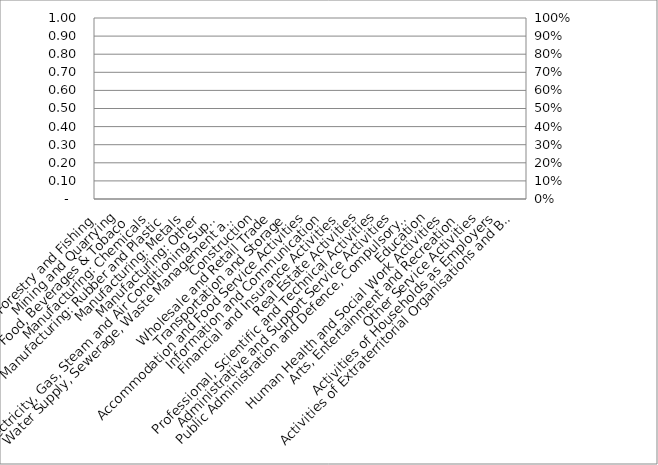
| Category | Series 0 |
|---|---|
| Agriculture, Forestry and Fishing | 0 |
| Mining and Quarrying | 0 |
| Manufacturing: Food, Beverages & Tobaco | 0 |
| Manufacturing: Chemicals | 0 |
| Manufacturing: Rubber and Plastic | 0 |
| Manufacturing: Metals | 0 |
| Manufacturing: Other | 0 |
| Electricity, Gas, Steam and Air Conditioning Supply | 0 |
| Water Supply, Sewerage, Waste Management and Remediation Activities | 0 |
| Construction | 0 |
| Wholesale and Retail Trade | 0 |
| Transportation and Storage | 0 |
| Accommodation and Food Service Activities | 0 |
| Information and Communication | 0 |
| Financial and Insurance Activities | 0 |
| Real Estate Activities | 0 |
| Professional, Scientific and Technical Activities | 0 |
| Administrative and Support Service Activities | 0 |
| Public Administration and Defence, Compulsory Social Security | 0 |
| Education | 0 |
| Human Health and Social Work Activities | 0 |
| Arts, Entertainment and Recreation | 0 |
| Other Service Activities | 0 |
| Activities of Households as Employers | 0 |
| Activities of Extraterritorial Organisations and Bodies | 0 |